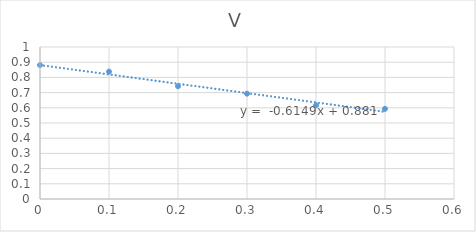
| Category | V |
|---|---|
| 0.5 | 0.593 |
| 0.4 | 0.617 |
| 0.3 | 0.693 |
| 0.2 | 0.742 |
| 0.1 | 0.838 |
| 0.0 | 0.881 |